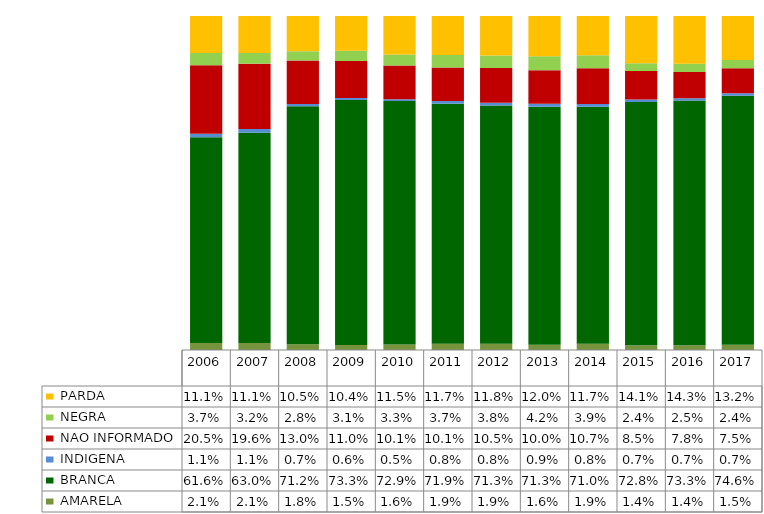
| Category |  AMARELA     |  BRANCA      |  INDIGENA    |  NAO INFORMADO  |  NEGRA       |  PARDA       |
|---|---|---|---|---|---|---|
| 2006.0 | 0.021 | 0.616 | 0.011 | 0.205 | 0.037 | 0.111 |
| 2007.0 | 0.021 | 0.63 | 0.011 | 0.196 | 0.032 | 0.111 |
| 2008.0 | 0.018 | 0.712 | 0.007 | 0.13 | 0.028 | 0.105 |
| 2009.0 | 0.015 | 0.733 | 0.006 | 0.11 | 0.031 | 0.104 |
| 2010.0 | 0.016 | 0.729 | 0.005 | 0.101 | 0.033 | 0.115 |
| 2011.0 | 0.019 | 0.719 | 0.008 | 0.101 | 0.037 | 0.117 |
| 2012.0 | 0.019 | 0.713 | 0.008 | 0.105 | 0.038 | 0.118 |
| 2013.0 | 0.016 | 0.713 | 0.009 | 0.1 | 0.042 | 0.12 |
| 2014.0 | 0.019 | 0.71 | 0.008 | 0.107 | 0.039 | 0.117 |
| 2015.0 | 0.014 | 0.728 | 0.007 | 0.085 | 0.024 | 0.141 |
| 2016.0 | 0.014 | 0.733 | 0.007 | 0.078 | 0.025 | 0.143 |
| 2017.0 | 0.015 | 0.746 | 0.007 | 0.075 | 0.024 | 0.132 |